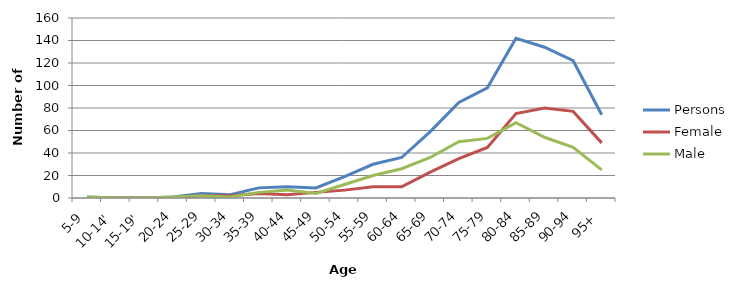
| Category | Persons | Female | Male |
|---|---|---|---|
| 5-9 | 1 | 0 | 1 |
| 10-14' | 0 | 0 | 0 |
| 15-19' | 0 | 0 | 0 |
| 20-24 | 1 | 0 | 1 |
| 25-29 | 4 | 2 | 2 |
| 30-34 | 3 | 2 | 1 |
| 35-39 | 9 | 4 | 5 |
| 40-44 | 10 | 3 | 7 |
| 45-49 | 9 | 5 | 4 |
| 50-54 | 19 | 7 | 12 |
| 55-59 | 30 | 10 | 20 |
| 60-64 | 36 | 10 | 26 |
| 65-69 | 59 | 23 | 36 |
| 70-74 | 85 | 35 | 50 |
| 75-79 | 98 | 45 | 53 |
| 80-84 | 142 | 75 | 67 |
| 85-89 | 134 | 80 | 54 |
| 90-94 | 122 | 77 | 45 |
| 95+ | 74 | 49 | 25 |